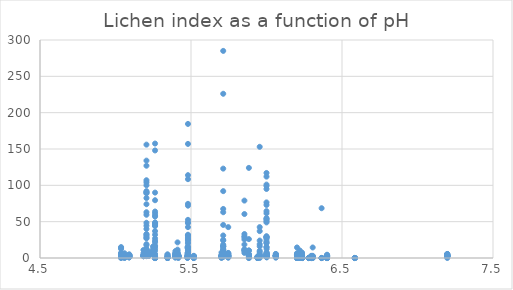
| Category | Lichen index as a function of sulfate deposition |
|---|---|
| 5.25 | 10 |
| 5.25 | 8 |
| 5.25 | 9.5 |
| 5.25 | 15.5 |
| 5.25 | 16 |
| 5.25 | 9 |
| 5.25 | 6 |
| 5.25 | 5.5 |
| 5.25 | 6.5 |
| 5.25 | 6 |
| 5.25 | 12.5 |
| 5.25 | 11 |
| 5.205 | 30 |
| 5.205 | 134 |
| 5.205 | 156 |
| 5.205 | 5 |
| 5.205 | 32 |
| 5.205 | 100 |
| 5.205 | 107 |
| 5.205 | 59.5 |
| 5.205 | 92 |
| 5.205 | 17.5 |
| 5.205 | 63 |
| 5.205 | 104 |
| 5.205 | 44.5 |
| 5.205 | 8.5 |
| 5.205 | 48.5 |
| 5.205 | 9.5 |
| 5.205 | 12.5 |
| 5.205 | 8 |
| 5.205 | 89 |
| 5.205 | 12 |
| 5.205 | 82.5 |
| 5.205 | 74 |
| 5.205 | 40 |
| 5.205 | 7.5 |
| 5.205 | 19 |
| 5.205 | 27 |
| 5.205 | 2.5 |
| 5.205 | 33 |
| 5.205 | 3 |
| 5.205 | 90 |
| 5.205 | 28 |
| 5.205 | 90.5 |
| 5.205 | 127 |
| 5.883333333 | 10 |
| 5.883333333 | 3.5 |
| 5.883333333 | 5 |
| 5.883333333 | 0 |
| 5.883333333 | 1 |
| 5.883333333 | 10.5 |
| 5.883333333 | 5.5 |
| 5.883333333 | 124 |
| 5.883333333 | 3 |
| 5.883333333 | 3 |
| 5.883333333 | 0 |
| 5.883333333 | 26 |
| 5.883333333 | 1.5 |
| 5.883333333 | 1.5 |
| 5.416153846 | 1.5 |
| 5.416153846 | 3.5 |
| 5.416153846 | 1 |
| 5.416153846 | 3 |
| 5.416153846 | 0.5 |
| 5.416153846 | 0.5 |
| 5.416153846 | 3 |
| 5.416153846 | 3 |
| 5.416153846 | 4 |
| 5.416153846 | 2 |
| 5.416153846 | 1.5 |
| 5.416153846 | 1.5 |
| 5.416153846 | 2.5 |
| 5.416153846 | 3 |
| 5.416153846 | 0.5 |
| 5.416153846 | 2.5 |
| 5.416153846 | 3 |
| 5.48 | 32 |
| 5.48 | 11 |
| 5.48 | 6 |
| 5.48 | 28 |
| 5.48 | 13 |
| 5.48 | 5 |
| 5.48 | 20 |
| 5.48 | 31 |
| 5.48 | 25 |
| 5.48 | 27 |
| 5.48 | 1 |
| 5.48 | 3.5 |
| 5.48 | 8 |
| 5.48 | 48 |
| 5.48 | 31 |
| 5.48 | 72 |
| 5.48 | 157 |
| 5.48 | 21.5 |
| 5.48 | 15 |
| 5.48 | 49 |
| 5.48 | 42.5 |
| 5.48 | 184.5 |
| 5.48 | 2 |
| 5.48 | 14 |
| 5.48 | 74.5 |
| 5.48 | 10.5 |
| 5.48 | 16 |
| 5.48 | 52.5 |
| 5.48 | 108.5 |
| 5.48 | 7 |
| 5.48 | 8.5 |
| 5.48 | 24.5 |
| 5.48 | 114 |
| 5.185 | 3 |
| 5.185 | 2.5 |
| 5.185 | 2.5 |
| 5.185 | 3.5 |
| 5.185 | 11 |
| 5.185 | 3 |
| 5.185 | 6.5 |
| 6.061666667 | 3 |
| 6.061666667 | 3.5 |
| 6.061666667 | 3 |
| 6.061666667 | 2.5 |
| 6.061666667 | 3 |
| 6.061666667 | 3.5 |
| 6.061666667 | 3 |
| 6.061666667 | 3 |
| 6.061666667 | 3 |
| 6.061666667 | 3.5 |
| 6.061666667 | 5.5 |
| 6.061666667 | 2.5 |
| 6.061666667 | 0.5 |
| 6.061666667 | 4.5 |
| 6.061666667 | 5.5 |
| 6.061666667 | 2 |
| 6.061666667 | 1 |
| 6.061666667 | 3 |
| 6.205 | 0 |
| 6.205 | 0 |
| 6.205 | 0 |
| 6.205 | 0 |
| 6.205 | 0 |
| 6.205 | 0 |
| 6.205 | 0 |
| 6.205 | 0 |
| 6.205 | 0 |
| 6.205 | 0 |
| 6.205 | 0 |
| 6.205 | 0 |
| 6.205 | 0 |
| 6.205 | 0 |
| 6.205 | 0 |
| 6.205 | 0 |
| 6.205 | 0 |
| 6.205 | 0 |
| 6.205 | 0 |
| 6.205 | 0 |
| 6.205 | 0 |
| 6.205 | 0 |
| 6.205 | 0 |
| 6.205 | 0 |
| 6.205 | 0 |
| 6.205 | 0 |
| 6.205 | 0 |
| 6.205 | 0 |
| 6.205 | 0 |
| 6.205 | 0 |
| 6.205 | 0 |
| 6.205 | 0 |
| 6.205 | 0.5 |
| 5.3967 | 2 |
| 5.3967 | 3 |
| 5.3967 | 2.5 |
| 5.3967 | 2.5 |
| 5.3967 | 3 |
| 5.3967 | 6 |
| 5.3967 | 3 |
| 5.3967 | 0.5 |
| 5.3967 | 2 |
| 5.3967 | 3 |
| 5.3967 | 4 |
| 5.3967 | 1.5 |
| 5.3967 | 5 |
| 5.3967 | 1.5 |
| 5.3967 | 3 |
| 5.3967 | 4 |
| 5.3967 | 3.5 |
| 5.3967 | 7 |
| 5.3967 | 2 |
| 5.3967 | 2.5 |
| 5.3967 | 2 |
| 5.3967 | 1 |
| 5.3967 | 3.5 |
| 5.3967 | 5 |
| 5.3967 | 2 |
| 5.3967 | 6 |
| 5.396666667 | 9.5 |
| 5.06 | 2 |
| 5.06 | 4 |
| 5.06 | 1.5 |
| 5.06 | 1.5 |
| 5.06 | 2 |
| 5.06 | 1.5 |
| 5.06 | 2.5 |
| 5.06 | 3 |
| 5.06 | 1.5 |
| 5.06 | 2.5 |
| 5.06 | 4 |
| 5.06 | 2.5 |
| 5.06 | 1.5 |
| 5.06 | 2.5 |
| 5.06 | 1.5 |
| 5.06 | 4 |
| 5.06 | 1.5 |
| 5.06 | 0.5 |
| 5.06 | 1.5 |
| 5.06 | 3 |
| 5.06 | 2.5 |
| 5.06 | 2.5 |
| 5.06 | 3 |
| 5.06 | 1.5 |
| 5.06 | 3 |
| 5.06 | 0 |
| 5.06 | 2 |
| 5.06 | 1.5 |
| 5.06 | 2.5 |
| 5.06 | 2 |
| 5.06 | 2 |
| 5.06 | 1.5 |
| 5.06 | 6.5 |
| 5.1854 | 3 |
| 5.1854 | 2.5 |
| 5.1854 | 2.5 |
| 5.1854 | 3 |
| 5.1854 | 3.5 |
| 5.1854 | 3 |
| 5.1854 | 3 |
| 5.1854 | 4 |
| 5.219166667 | 4.5 |
| 5.219166667 | 3.5 |
| 5.219166667 | 3.5 |
| 5.219166667 | 7 |
| 5.219166667 | 4.5 |
| 5.219166667 | 3 |
| 5.219166667 | 3 |
| 5.219166667 | 3.5 |
| 5.219166667 | 5 |
| 5.219166667 | 8.5 |
| 5.219166667 | 3 |
| 5.219166667 | 4 |
| 5.219166667 | 4 |
| 6.0 | 73 |
| 6.0 | 95 |
| 6.0 | 29 |
| 6.0 | 99 |
| 6.0 | 117 |
| 6.0 | 27 |
| 6.0 | 55 |
| 6.0 | 6 |
| 6.0 | 21 |
| 6.0 | 112 |
| 6.0 | 29 |
| 6.0 | 50.5 |
| 6.0 | 64.5 |
| 6.0 | 53 |
| 6.0 | 76.5 |
| 6.0 | 53.5 |
| 6.0 | 15 |
| 6.0 | 30 |
| 6.0 | 101 |
| 6.0 | 23 |
| 6.0 | 27 |
| 6.0 | 15 |
| 6.0 | 61.5 |
| 6.0 | 49 |
| 6.0 | 29 |
| 6.0 | 20.5 |
| 6.0 | 3 |
| 6.0 | 5 |
| 6.0 | 5 |
| 5.955 | 0 |
| 5.955 | 37 |
| 5.955 | 2 |
| 5.955 | 8 |
| 5.955 | 3 |
| 5.955 | 2.5 |
| 5.955 | 4 |
| 5.955 | 42.5 |
| 5.955 | 19 |
| 5.955 | 4 |
| 5.955 | 5.5 |
| 5.955 | 16 |
| 5.955 | 153 |
| 5.955 | 24 |
| 5.955 | 10 |
| 5.411 | 5.5 |
| 5.411 | 7 |
| 5.411 | 3.5 |
| 5.411 | 4 |
| 5.411 | 4 |
| 5.411 | 5.5 |
| 5.411 | 21.5 |
| 5.411 | 3 |
| 5.411 | 6 |
| 5.411 | 4.5 |
| 5.411 | 9 |
| 5.411 | 3 |
| 5.411 | 2.5 |
| 5.411 | 11.5 |
| 5.411 | 6.5 |
| 5.411 | 2.5 |
| 5.411 | 4 |
| 5.411 | 3 |
| 5.411 | 4 |
| 5.411 | 3 |
| 5.411 | 4.5 |
| 6.000833333 | 4 |
| 6.000833333 | 3.5 |
| 6.000833333 | 4.5 |
| 6.000833333 | 2 |
| 6.000833333 | 2 |
| 6.000833333 | 3 |
| 6.000833333 | 3.5 |
| 6.000833333 | 1.5 |
| 6.000833333 | 8 |
| 6.000833333 | 1.5 |
| 6.000833333 | 1.5 |
| 6.000833333 | 3.5 |
| 6.000833333 | 12.5 |
| 6.000833333 | 3 |
| 6.000833333 | 6.5 |
| 6.000833333 | 3 |
| 6.000833333 | 4.5 |
| 6.000833333 | 6.5 |
| 6.000833333 | 1 |
| 6.000833333 | 5 |
| 6.000833333 | 2 |
| 6.000833333 | 3 |
| 6.000833333 | 2.5 |
| 6.000833333 | 3 |
| 6.000833333 | 2.5 |
| 6.000833333 | 2.5 |
| 6.000833333 | 3.5 |
| 6.000833333 | 3.5 |
| 6.000833333 | 1 |
| 6.000833333 | 3 |
| 5.940714286 | 0 |
| 5.940714286 | 0.5 |
| 5.940714286 | 1 |
| 5.940714286 | 0 |
| 5.940714286 | 0 |
| 5.940714286 | 0 |
| 5.940714286 | 1.5 |
| 5.940714286 | 2 |
| 5.940714286 | 0 |
| 5.940714286 | 0 |
| 5.940714286 | 0.5 |
| 5.940714286 | 0 |
| 5.940714286 | 0 |
| 5.940714286 | 1.5 |
| 5.940714286 | 0 |
| 5.940714286 | 0 |
| 5.476363636 | 0 |
| 5.476363636 | 1.5 |
| 5.476363636 | 0.5 |
| 5.476363636 | 2 |
| 5.476363636 | 2.5 |
| 5.476363636 | 1.5 |
| 5.476363636 | 6.5 |
| 5.476363636 | 14.5 |
| 5.476363636 | 4 |
| 5.476363636 | 3 |
| 5.702 | 1 |
| 5.702 | 3 |
| 5.702 | 3 |
| 5.702 | 2 |
| 5.702 | 2.5 |
| 5.702 | 1.5 |
| 5.702 | 1.5 |
| 5.702 | 1.5 |
| 5.702 | 3 |
| 5.702 | 7.5 |
| 5.702 | 2 |
| 5.702 | 1.5 |
| 5.702 | 2.5 |
| 5.702 | 3.5 |
| 5.702 | 2 |
| 5.702 | 0 |
| 5.702 | 2.5 |
| 5.702 | 2 |
| 5.702 | 2 |
| 5.702 | 2.5 |
| 5.702 | 2 |
| 5.702 | 1 |
| 5.702 | 2 |
| 5.702 | 2.5 |
| 5.702 | 2 |
| 5.702 | 1.5 |
| 5.702 | 2.5 |
| 5.702 | 1.5 |
| 5.702 | 1.5 |
| 5.702 | 1.5 |
| 5.702 | 4 |
| 5.702 | 2 |
| 5.702 | 3 |
| 5.713333333 | 8 |
| 5.713333333 | 4.5 |
| 5.713333333 | 18.5 |
| 5.713333333 | 67.5 |
| 5.713333333 | 5 |
| 5.713333333 | 226 |
| 5.713333333 | 5 |
| 5.713333333 | 3.5 |
| 5.713333333 | 3 |
| 5.713333333 | 1.5 |
| 5.713333333 | 16 |
| 5.713333333 | 8 |
| 5.713333333 | 9 |
| 5.713333333 | 16.5 |
| 5.713333333 | 2.5 |
| 5.713333333 | 31 |
| 5.713333333 | 4 |
| 5.713333333 | 12.5 |
| 5.713333333 | 123 |
| 5.713333333 | 63 |
| 5.713333333 | 4 |
| 5.713333333 | 10 |
| 5.713333333 | 24 |
| 5.713333333 | 15.5 |
| 5.713333333 | 3 |
| 5.713333333 | 10.5 |
| 5.713333333 | 3.5 |
| 5.713333333 | 11.5 |
| 5.713333333 | 45.5 |
| 5.713333333 | 285 |
| 5.713333333 | 25 |
| 5.713333333 | 16.5 |
| 5.713333333 | 92 |
| 5.091 | 1.5 |
| 5.091 | 3.5 |
| 5.091 | 1 |
| 5.091 | 3 |
| 5.091 | 3.5 |
| 5.091 | 2.5 |
| 5.091 | 2 |
| 5.091 | 4 |
| 5.091 | 3 |
| 5.091 | 2 |
| 5.091 | 1 |
| 5.091 | 2 |
| 5.091 | 5 |
| 5.091 | 3.5 |
| 5.091 | 1 |
| 5.091 | 1 |
| 5.091 | 2.5 |
| 5.091 | 4 |
| 5.091 | 1.5 |
| 5.091 | 4 |
| 5.091 | 4.5 |
| 5.091 | 4 |
| 5.036923077 | 5.5 |
| 5.036923077 | 2 |
| 5.036923077 | 5 |
| 5.036923077 | 3 |
| 5.036923077 | 4.5 |
| 5.036923077 | 1 |
| 5.036923077 | 1.5 |
| 5.036923077 | 3 |
| 5.036923077 | 4 |
| 5.036923077 | 12.5 |
| 5.036923077 | 6 |
| 5.036923077 | 3 |
| 5.036923077 | 1.5 |
| 5.036923077 | 5 |
| 5.036923077 | 7 |
| 5.036923077 | 15 |
| 5.036923077 | 0.5 |
| 5.036923077 | 2 |
| 5.036923077 | 3 |
| 5.036923077 | 14 |
| 5.036923077 | 3.5 |
| 5.036923077 | 0.5 |
| 5.036923077 | 0 |
| 6.279166667 | 0 |
| 6.279166667 | 0 |
| 6.279166667 | 0 |
| 6.279166667 | 0 |
| 6.279166667 | 0 |
| 6.279166667 | 0 |
| 6.279166667 | 0 |
| 6.279166667 | 0 |
| 6.279166667 | 0 |
| 6.279166667 | 0 |
| 6.279166667 | 0 |
| 6.279166667 | 0 |
| 6.279166667 | 0 |
| 5.518888889 | 1.5 |
| 5.518888889 | 1 |
| 5.518888889 | 1 |
| 5.518888889 | 1.5 |
| 5.518888889 | 0 |
| 5.518888889 | 1 |
| 5.518888889 | 0.5 |
| 5.518888889 | 0 |
| 5.518888889 | 0 |
| 5.518888889 | 0.5 |
| 5.518888889 | 2 |
| 5.518888889 | 0.5 |
| 5.518888889 | 1.5 |
| 5.518888889 | 1.5 |
| 5.518888889 | 2.5 |
| 5.518888889 | 0.5 |
| 5.518888889 | 0.5 |
| 5.518888889 | 3 |
| 5.518888889 | 2.5 |
| 6.365 | 0 |
| 6.365 | 0 |
| 6.365 | 0 |
| 6.365 | 0 |
| 6.365 | 68.5 |
| 6.365 | 0 |
| 6.365 | 0 |
| 6.365 | 0 |
| 6.365 | 0 |
| 6.365 | 0 |
| 6.365 | 0 |
| 6.365 | 0 |
| 6.365 | 0 |
| 5.746666667 | 7 |
| 5.746666667 | 42.5 |
| 5.746666667 | 2.5 |
| 5.746666667 | 6.5 |
| 5.746666667 | 3.5 |
| 5.746666667 | 2.5 |
| 5.746666667 | 6 |
| 5.746666667 | 3.5 |
| 5.746666667 | 5 |
| 5.746666667 | 1 |
| 5.746666667 | 1 |
| 5.746666667 | 4 |
| 5.746666667 | 2 |
| 5.746666667 | 3 |
| 5.746666667 | 1.5 |
| 5.746666667 | 0.5 |
| 5.746666667 | 4 |
| 5.746666667 | 2.5 |
| 6.401 | 3 |
| 6.401 | 3 |
| 6.401 | 3 |
| 6.401 | 2 |
| 6.401 | 1.5 |
| 6.401 | 4 |
| 6.401 | 1.5 |
| 6.401 | 1 |
| 6.401 | 4.5 |
| 6.401 | 3 |
| 6.401 | 3 |
| 6.401 | 2.5 |
| 6.401 | 1 |
| 6.401 | 2 |
| 6.401 | 1.5 |
| 6.401 | 0 |
| 6.401 | 2.5 |
| 6.401 | 3 |
| 6.401 | 2.5 |
| 6.401 | 3.5 |
| 6.401 | 0 |
| 6.401 | 0 |
| 6.401 | 0 |
| 6.401 | 0 |
| 6.401 | 0 |
| 6.401 | 0 |
| 6.401 | 3.5 |
| 6.401 | 2.5 |
| 6.401 | 1.5 |
| 5.85375 | 10.5 |
| 5.85375 | 7 |
| 5.85375 | 18.5 |
| 5.85375 | 30 |
| 5.85375 | 11.5 |
| 5.85375 | 28.5 |
| 5.85375 | 79 |
| 5.85375 | 60.5 |
| 5.85375 | 33 |
| 5.85375 | 9.5 |
| 5.85375 | 12 |
| 5.85375 | 25.5 |
| 6.585 | 0 |
| 6.585 | 0 |
| 6.585 | 0 |
| 6.585 | 0 |
| 6.585 | 0 |
| 6.585 | 0 |
| 6.585 | 0 |
| 6.585 | 0 |
| 6.585 | 0 |
| 6.296363636 | 0.5 |
| 6.296363636 | 0.5 |
| 6.296363636 | 1 |
| 6.296363636 | 0 |
| 6.296363636 | 0 |
| 6.296363636 | 0 |
| 6.296363636 | 2 |
| 6.296363636 | 0 |
| 6.296363636 | 0 |
| 6.296363636 | 0 |
| 6.296363636 | 1 |
| 6.296363636 | 1 |
| 6.296363636 | 1.5 |
| 6.296363636 | 0 |
| 6.296363636 | 1.5 |
| 6.296363636 | 1 |
| 6.296363636 | 1.5 |
| 6.296363636 | 0 |
| 6.296363636 | 1.5 |
| 6.296363636 | 3 |
| 6.296363636 | 0.5 |
| 6.296363636 | 1.5 |
| 6.296363636 | 2.5 |
| 6.296363636 | 1.5 |
| 6.296363636 | 0 |
| 5.3446 | 2 |
| 5.3446 | 0 |
| 5.3446 | 0 |
| 5.3446 | 0 |
| 5.3446 | 0.5 |
| 5.3446 | 3 |
| 5.3446 | 0 |
| 5.3446 | 0 |
| 5.3446 | 4.56 |
| 5.3446 | 0 |
| 5.3446 | 0 |
| 5.3446 | 0 |
| 5.3446 | 0 |
| 5.3446 | 0 |
| 5.3446 | 0 |
| 5.3446 | 0 |
| 5.3446 | 0 |
| 5.3446 | 2 |
| 5.3446 | 1 |
| 5.3446 | 0 |
| 5.3446 | 5 |
| 5.3446 | 1.5 |
| 5.3446 | 0 |
| 5.3446 | 0 |
| 5.3446 | 0 |
| 5.3446 | 0 |
| 5.3446 | 0 |
| 6.202 | 0 |
| 6.202 | 0 |
| 6.202 | 4.5 |
| 6.202 | 4 |
| 6.202 | 3.5 |
| 6.202 | 1 |
| 6.202 | 5 |
| 6.202 | 4.5 |
| 6.202 | 0 |
| 6.202 | 3 |
| 6.202 | 0.5 |
| 6.202 | 6.5 |
| 6.202 | 0.5 |
| 6.202 | 4.5 |
| 6.202 | 5.5 |
| 6.202 | 3 |
| 6.202 | 5 |
| 6.202 | 3 |
| 6.202 | 14.5 |
| 6.202 | 3.5 |
| 6.202 | 0 |
| 6.202 | 0.5 |
| 6.22 | 2.5 |
| 6.22 | 1 |
| 6.22 | 2 |
| 6.22 | 2 |
| 6.22 | 3 |
| 6.22 | 2 |
| 6.22 | 0.5 |
| 6.22 | 1.5 |
| 6.22 | 2.5 |
| 6.22 | 1 |
| 6.22 | 2.5 |
| 6.22 | 3 |
| 6.22 | 2 |
| 6.22 | 0.5 |
| 6.22 | 7 |
| 6.22 | 1 |
| 6.22 | 2 |
| 6.22 | 2 |
| 6.22 | 3 |
| 6.22 | 1 |
| 6.22 | 3 |
| 6.22 | 0.5 |
| 6.22 | 1.5 |
| 6.22 | 0.5 |
| 6.22 | 3 |
| 6.22 | 0.5 |
| 6.22 | 3 |
| 6.22 | 1 |
| 6.22 | 1 |
| 6.22 | 2 |
| 6.22 | 2 |
| 6.22 | 10.5 |
| 6.22 | 2.5 |
| 5.262 | 5.5 |
| 5.262 | 90 |
| 5.262 | 0 |
| 5.262 | 148 |
| 5.262 | 57 |
| 5.262 | 2 |
| 5.262 | 47.5 |
| 5.262 | 27 |
| 5.262 | 79.5 |
| 5.262 | 17 |
| 5.262 | 48 |
| 5.262 | 157.5 |
| 5.262 | 61.5 |
| 5.262 | 15.5 |
| 5.262 | 23.5 |
| 5.262 | 0 |
| 5.262 | 32 |
| 5.262 | 0 |
| 5.262 | 0 |
| 5.262 | 2.5 |
| 5.262 | 58.5 |
| 5.262 | 10 |
| 5.262 | 49 |
| 5.262 | 0 |
| 5.262 | 0 |
| 5.262 | 37 |
| 5.262 | 13 |
| 5.262 | 64 |
| 5.262 | 44 |
| 5.262 | 46 |
| 5.262 | 45 |
| 5.262 | 21.5 |
| 6.306 | 0.5 |
| 6.306 | 3 |
| 6.306 | 2.5 |
| 6.306 | 1.5 |
| 6.306 | 2 |
| 6.306 | 0 |
| 6.306 | 0 |
| 6.306 | 14.5 |
| 6.306 | 0.5 |
| 6.235 | 0.5 |
| 6.235 | 0.5 |
| 6.235 | 7.5 |
| 6.235 | 0 |
| 6.235 | 1 |
| 6.235 | 0.5 |
| 6.235 | 2.5 |
| 6.235 | 0 |
| 6.235 | 0 |
| 6.235 | 3 |
| 6.235 | 1 |
| 6.235 | 0 |
| 6.235 | 1 |
| 6.235 | 1 |
| 6.235 | 0 |
| 6.235 | 0.5 |
| 6.235 | 0 |
| 6.235 | 3 |
| 6.235 | 0 |
| 6.235 | 2 |
| 6.235 | 0 |
| 6.235 | 0 |
| 6.235 | 4.5 |
| 6.235 | 3 |
| 6.235 | 2.5 |
| 6.235 | 3 |
| 6.235 | 6.5 |
| 6.235 | 2.5 |
| 6.235 | 2.5 |
| 6.235 | 0.5 |
| 6.235 | 1 |
| 6.235 | 2.5 |
| 6.235 | 2 |
| 7.197142857 | 3 |
| 7.197142857 | 3 |
| 7.197142857 | 3 |
| 7.197142857 | 3 |
| 7.197142857 | 3 |
| 7.197142857 | 2 |
| 7.197142857 | 5.5 |
| 7.197142857 | 3 |
| 7.197142857 | 2.5 |
| 7.197142857 | 5 |
| 7.197142857 | 4.5 |
| 7.197142857 | 3 |
| 7.197142857 | 4.5 |
| 7.197142857 | 3 |
| 7.197142857 | 2 |
| 7.197142857 | 5.5 |
| 7.197142857 | 2.5 |
| 7.197142857 | 0 |
| 7.197142857 | 3.5 |
| 7.197142857 | 2.5 |
| 7.197142857 | 4.5 |
| 7.197142857 | 5.5 |
| 7.197142857 | 2 |
| 7.197142857 | 3 |
| 7.197142857 | 3 |
| 7.197142857 | 3 |
| 7.197142857 | 3 |
| 7.197142857 | 3 |